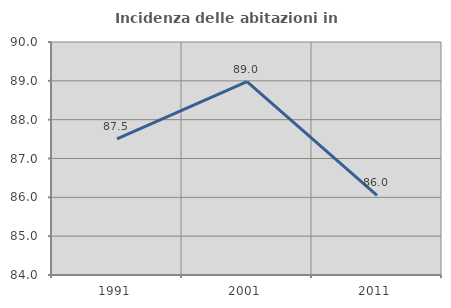
| Category | Incidenza delle abitazioni in proprietà  |
|---|---|
| 1991.0 | 87.505 |
| 2001.0 | 88.977 |
| 2011.0 | 86.049 |